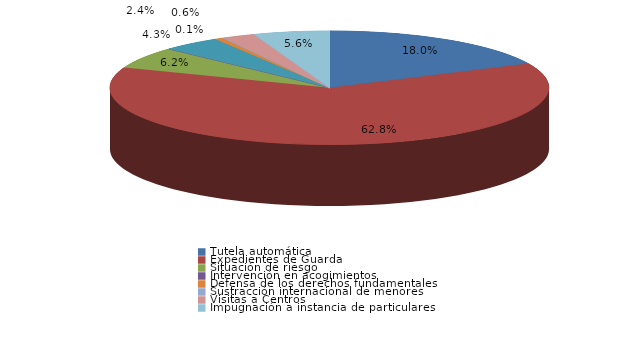
| Category | Series 0 |
|---|---|
| Tutela automática | 178 |
| Expedientes de Guarda | 621 |
| Situación de riesgo | 61 |
| Intervención en acogimientos | 0 |
| Intervención en adopciones | 43 |
| Defensa de los derechos fundamentales | 6 |
| Sustracción internacional de menores | 1 |
| Visitas a Centros | 24 |
| Ensayos Clínicos | 0 |
| Impugnación a instacia del Fiscal | 0 |
| Impugnación a instancia de particulares | 55 |